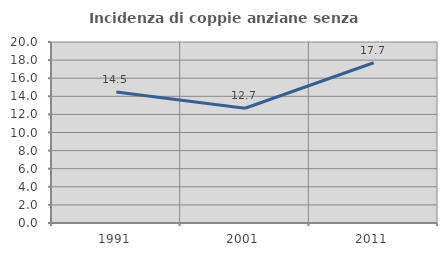
| Category | Incidenza di coppie anziane senza figli  |
|---|---|
| 1991.0 | 14.474 |
| 2001.0 | 12.676 |
| 2011.0 | 17.703 |